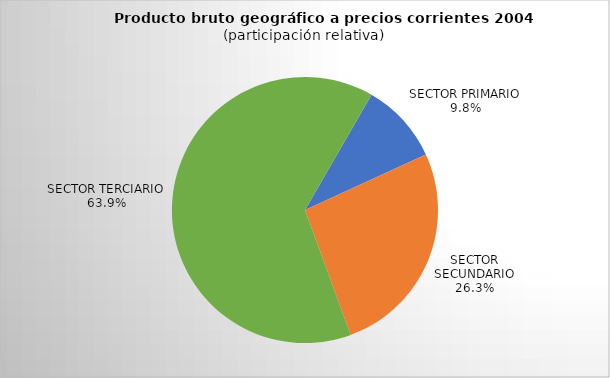
| Category | Series 0 |
|---|---|
| SECTOR PRIMARIO | 592.264 |
| SECTOR SECUNDARIO | 1585.817 |
| SECTOR TERCIARIO | 3857.842 |